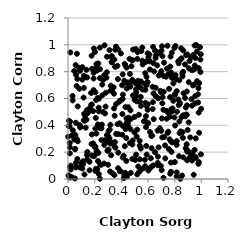
| Category | Series 0 |
|---|---|
| 0.046676937674423886 | 0.805 |
| 0.1731907339990109 | 0.641 |
| 0.23156018715488924 | 0.037 |
| 0.42760766730506783 | 0.851 |
| 0.5336893021140406 | 0.691 |
| 0.09268886672519401 | 0.39 |
| 0.6367927705438385 | 0.573 |
| 0.9290513467448243 | 0.811 |
| 0.5379660975195389 | 0.248 |
| 0.7785230968841657 | 0.503 |
| 0.4707104948257748 | 0.446 |
| 0.7468949703240096 | 0.343 |
| 0.8391897326390824 | 0.561 |
| 0.34968576601538326 | 0.241 |
| 0.6953053178982544 | 0.785 |
| 0.2968760122465636 | 0.21 |
| 0.5696426322543541 | 0.43 |
| 0.6722983463575628 | 0.103 |
| 0.41036892436965217 | 0.78 |
| 0.5864340884211007 | 0.246 |
| 0.4175408332572171 | 0.173 |
| 0.5846683655671804 | 0.873 |
| 0.8909354414835754 | 0.477 |
| 0.013335728364849 | 0.191 |
| 0.11955547361146536 | 0.679 |
| 0.7665870626792595 | 0.039 |
| 0.6250503684640436 | 0.321 |
| 0.1328308287717144 | 0.383 |
| 0.09125341376203373 | 0.384 |
| 0.519206114093471 | 0.368 |
| 0.5092706347199005 | 0.969 |
| 0.2057818210240638 | 0.646 |
| 0.917273317381685 | 0.31 |
| 0.08429098524658475 | 0.829 |
| 0.5367592920172873 | 0.686 |
| 0.37214312046848014 | 0.409 |
| 0.32955264627195086 | 0.869 |
| 0.4754985411567399 | 0.84 |
| 0.6524488144445785 | 0.2 |
| 0.08940384945948819 | 0.806 |
| 0.06554562086051482 | 0.298 |
| 0.7155857116474972 | 0.516 |
| 0.5565957550004644 | 0.881 |
| 0.07018524425496449 | 0.149 |
| 0.7394409686287119 | 0.449 |
| 0.8590399694918804 | 0.349 |
| 0.057574957408292556 | 0.848 |
| 0.1640557005931702 | 0.529 |
| 0.8646857087342421 | 0.475 |
| 0.597121755670744 | 0.937 |
| 0.22286788275097186 | 0.604 |
| 0.8962677892962819 | 0.211 |
| 0.05966879743334477 | 0.121 |
| 0.8829805018857326 | 0.23 |
| 0.4433115345549993 | 0.02 |
| 0.7727190102088954 | 0.053 |
| 0.5390898360487064 | 0.147 |
| 0.877691282450784 | 0.604 |
| 0.06703394839677779 | 0.934 |
| 0.6721994752635393 | 0.36 |
| 0.2846353952011683 | 0.643 |
| 0.3286666740754009 | 0.917 |
| 0.9331424568217861 | 0.189 |
| 0.25059040371349994 | 0.378 |
| 0.16177745395152135 | 0.065 |
| 0.14742301760385748 | 0.492 |
| 0.8595227222581635 | 0.765 |
| 0.3744627109753005 | 0.745 |
| 0.19228619816168752 | 0.792 |
| 0.2237660073145369 | 0.407 |
| 0.5092260927614612 | 0.711 |
| 0.7224204070046648 | 0.313 |
| 0.19194597458374296 | 0.749 |
| 0.2569839202288496 | 0.704 |
| 0.4314366114576344 | 0.372 |
| 0.0547269025426534 | 0.328 |
| 0.509920508866802 | 0.668 |
| 0.9805405721133529 | 0.827 |
| 0.8153659750011059 | 0.049 |
| 0.6747229036105801 | 0.166 |
| 0.4223224963584687 | 0.023 |
| 0.8628799058367227 | 0.799 |
| 0.8327770680637624 | 0.17 |
| 0.6208491824398406 | 0.154 |
| 0.5112553337236531 | 0.181 |
| 0.1950958757126044 | 0.17 |
| 0.3544520413392117 | 0.963 |
| 0.9212706771769078 | 0.193 |
| 0.3020972747949281 | 0.32 |
| 0.8375365185972018 | 0.569 |
| 0.052238632556893504 | 0.004 |
| 0.8130604562920429 | 0.743 |
| 0.9370957154208669 | 0.697 |
| 0.19401418803622206 | 0.972 |
| 0.9499446730407738 | 0.217 |
| 0.9395151472527965 | 0.925 |
| 0.036636022783196574 | 0.363 |
| 0.9255698461596198 | 0.595 |
| 0.7634444239329383 | 0.464 |
| 0.4866858603612687 | 0.623 |
| 0.38935800254068825 | 0.057 |
| 0.4557319380780795 | 0.457 |
| 0.24084133738431882 | 0.109 |
| 0.4056241756335786 | 0.699 |
| 0.7072956053577886 | 0.565 |
| 0.17869045569367317 | 0.332 |
| 0.2168766772427906 | 0.808 |
| 0.4097821111222963 | 0.597 |
| 0.4984210118251923 | 0.348 |
| 0.8934281752644695 | 0.14 |
| 0.7985944220098996 | 0.459 |
| 0.43978977307100736 | 0.717 |
| 0.23875659458211201 | 0.979 |
| 0.5146095974420601 | 0.579 |
| 0.752792451541724 | 0.781 |
| 0.20892436236240533 | 0.186 |
| 0.3156066523986101 | 0.056 |
| 0.8156582640601323 | 0.655 |
| 0.1773685117092146 | 0.175 |
| 0.3931472308274868 | 0.058 |
| 0.01286693904584747 | 0.268 |
| 0.6878301164890219 | 0.938 |
| 0.9302752011022033 | 0.138 |
| 0.597187901010962 | 0.516 |
| 0.32052714300663593 | 0.695 |
| 0.2168477848707807 | 0.839 |
| 0.38875025675613023 | 0.582 |
| 0.01736045135898978 | 0.943 |
| 0.8976954201139312 | 0.365 |
| 0.30467689092527306 | 0.357 |
| 0.9838768596884649 | 0.715 |
| 0.7998085724246662 | 0.626 |
| 0.4377117583783472 | 0.134 |
| 0.20186721276086267 | 0.947 |
| 0.8308493931554167 | 0.55 |
| 0.7084889299643606 | 0.915 |
| 0.6994989402984891 | 0.359 |
| 0.23003936401347205 | 0.532 |
| 0.5799627387163104 | 0.664 |
| 0.589466531291116 | 0.7 |
| 0.9785981418582956 | 0.677 |
| 0.6147685263011925 | 0.351 |
| 0.3828943100506701 | 0.575 |
| 0.23957370365303335 | 0.819 |
| 0.5819730832315049 | 0.568 |
| 0.0471722198335955 | 0.293 |
| 0.9747172168335393 | 0.631 |
| 0.4851650287341322 | 0.287 |
| 0.2090150252280079 | 0.076 |
| 0.29189423171228585 | 0.327 |
| 0.7727391313128991 | 0.279 |
| 0.14242598938925052 | 0.178 |
| 0.942835989518905 | 0.031 |
| 0.5403230809583446 | 0.577 |
| 0.4681067112876465 | 0.372 |
| 0.8515045136892441 | 0.461 |
| 0.6463657964301295 | 0.802 |
| 0.23893202538417474 | 0.003 |
| 0.49045672037080884 | 0.726 |
| 0.3706067786411054 | 0.843 |
| 0.011603717096283836 | 0.011 |
| 0.13044044634643015 | 0.759 |
| 0.7741159163835692 | 0.519 |
| 0.7351591692281364 | 0.762 |
| 0.8995198972721726 | 0.208 |
| 0.2196414838713818 | 0.074 |
| 0.059234877027061233 | 0.419 |
| 0.5572932057896541 | 0.98 |
| 0.9817779440189164 | 0.126 |
| 0.27404348837066406 | 0.996 |
| 0.6528094300983222 | 0.955 |
| 0.11687470963969998 | 0.607 |
| 0.28181051340614854 | 0.539 |
| 0.7568397486729 | 0.223 |
| 0.520176294162281 | 0.896 |
| 0.5795129214809566 | 0.789 |
| 0.021428901937924915 | 0.1 |
| 0.38695176546716287 | 0.415 |
| 0.49946462558968147 | 0.591 |
| 0.6014732816024693 | 0.417 |
| 0.2712519921636725 | 0.774 |
| 0.13853399145398415 | 0.442 |
| 0.8556199636965999 | 0.026 |
| 0.8344403950042217 | 0.736 |
| 0.7901646861157391 | 0.713 |
| 0.752416801457777 | 0.353 |
| 0.16144195128851072 | 0.129 |
| 0.028684990321949867 | 0.324 |
| 0.9681500463335102 | 0.729 |
| 0.5454567520497118 | 0.613 |
| 0.18899549003778846 | 0.265 |
| 0.32327126791351357 | 0.177 |
| 0.5901798876041708 | 0.182 |
| 0.12360925044257637 | 0.034 |
| 0.8941179046650222 | 0.205 |
| 0.8454051927353424 | 0.354 |
| 0.3110599835457872 | 0.302 |
| 0.46474136235282115 | 0.783 |
| 0.7666994723166691 | 0.838 |
| 0.47757962831922895 | 0.888 |
| 0.5964522816426117 | 0.723 |
| 0.3230929309330791 | 0.271 |
| 0.4404803323994665 | 0.674 |
| 0.5375475191852845 | 0.285 |
| 0.33392427875408065 | 0.042 |
| 0.24889701971087067 | 0.106 |
| 0.0010635826426977852 | 0.315 |
| 0.30048827100565284 | 0.106 |
| 0.6770147875417601 | 0.601 |
| 0.3603756276541707 | 0.558 |
| 0.8147388297407242 | 0.02 |
| 0.5250355212838486 | 0.732 |
| 0.584997234121754 | 0.386 |
| 0.7282032309949886 | 0.25 |
| 0.46795644756283933 | 0.512 |
| 0.39663160583756957 | 0.936 |
| 0.004017448057230958 | 0.026 |
| 0.034287747404613475 | 0.619 |
| 0.6318326608256549 | 0.324 |
| 0.6793232202820944 | 0.235 |
| 0.6219023781600583 | 0.088 |
| 0.40665322084471983 | 0.33 |
| 0.4301725525817708 | 0.536 |
| 0.005926100241357826 | 0.394 |
| 0.18058778471610612 | 0.821 |
| 0.4849873381048481 | 0.885 |
| 0.17822526094861293 | 0.555 |
| 0.23142157496354893 | 0.505 |
| 0.1388701952417476 | 0.814 |
| 0.7532573207696533 | 0.494 |
| 0.7839074247458218 | 0.526 |
| 0.6117314428070794 | 0.077 |
| 0.05228154762342658 | 0.222 |
| 0.33103349226327805 | 0.661 |
| 0.27751942156855225 | 0.489 |
| 0.4826434473045821 | 0.257 |
| 0.7292939424367355 | 0.154 |
| 0.7718510145786598 | 0.122 |
| 0.7009824638826786 | 0.957 |
| 0.6997395988194663 | 0.803 |
| 0.5458758141814352 | 0.227 |
| 0.42218435398407644 | 0.733 |
| 0.5326873376344007 | 0.052 |
| 0.20104690119422503 | 0.239 |
| 0.22739539564156597 | 0.194 |
| 0.11404873586985102 | 0.111 |
| 0.6966209705767614 | 0.097 |
| 0.2536996646733097 | 0.405 |
| 0.029349135643793933 | 0.013 |
| 0.4191301906429188 | 0.006 |
| 0.6965018484824774 | 0.648 |
| 0.261613111439334 | 0.5 |
| 0.09031626180511935 | 0.086 |
| 0.8617144096504336 | 0.307 |
| 0.6623028654885308 | 0.95 |
| 0.8047026871852438 | 0.634 |
| 0.5795040314999311 | 0.096 |
| 0.9509197089460705 | 0.846 |
| 0.9116271095676838 | 0.88 |
| 0.7653796191227267 | 0.61 |
| 0.7982351386778459 | 0.977 |
| 0.6567747601375253 | 0.902 |
| 0.7763192005087426 | 0.202 |
| 0.360275278710591 | 0.336 |
| 0.5267040356092753 | 0.093 |
| 0.12472536284638086 | 0.436 |
| 0.3178613780326637 | 0.404 |
| 0.034895528340997774 | 0.586 |
| 0.9541997551984307 | 0.564 |
| 0.26219415900358123 | 0.738 |
| 0.9759566808740957 | 0.57 |
| 0.06406409400634035 | 0.298 |
| 0.702666696735508 | 0.066 |
| 0.06018690966733417 | 0.777 |
| 0.8775115392148062 | 0.854 |
| 0.2753304862945135 | 0.289 |
| 0.17473535762787337 | 0.554 |
| 0.3279488693203214 | 0.871 |
| 0.6143881808407408 | 0.817 |
| 0.3113338534782187 | 0.96 |
| 0.22482096264188062 | 0.134 |
| 0.8650165731351144 | 0.161 |
| 0.5116528102095552 | 0.646 |
| 0.8442961135586228 | 0.892 |
| 0.42586921903577735 | 0.245 |
| 0.14996468605418806 | 0.497 |
| 0.6348286272017003 | 0.521 |
| 0.4999931282567323 | 0.463 |
| 0.05405943608713265 | 0.224 |
| 0.9773985862411543 | 0.113 |
| 0.4707546040542924 | 0.045 |
| 0.5054530087620377 | 0.142 |
| 0.7429478002552824 | 0.823 |
| 0.23562032283682216 | 0.381 |
| 0.547349668052422 | 0.545 |
| 0.6427055654996492 | 0.446 |
| 0.6596077660288989 | 0.615 |
| 0.5489249252545415 | 0.07 |
| 0.5498278083829402 | 0.954 |
| 0.10751676692487913 | 0.078 |
| 0.762517824391527 | 0.296 |
| 0.5099286013655342 | 0.621 |
| 0.35000501313897375 | 0.471 |
| 0.8803495025709801 | 0.467 |
| 0.4296417057332826 | 0.046 |
| 0.17719850614638696 | 0.919 |
| 0.2920733755424991 | 0.911 |
| 0.7462450643580057 | 0.993 |
| 0.602907782331563 | 0.905 |
| 0.9929195489582779 | 0.89 |
| 0.06477872015754783 | 0.693 |
| 0.5893531135583372 | 0.543 |
| 0.4521831901090685 | 0.39 |
| 0.43695466735920246 | 0.305 |
| 0.34800778798052007 | 0.029 |
| 0.5190108359200212 | 0.035 |
| 0.21089338614616993 | 0.589 |
| 0.3535897971083259 | 0.836 |
| 0.9499482972654503 | 0.995 |
| 0.8900513913134721 | 0.259 |
| 0.20531044773496626 | 0.06 |
| 0.06988730031232145 | 0.746 |
| 0.827024461425214 | 0.593 |
| 0.5151721267317756 | 0.316 |
| 0.14492622633513338 | 0.201 |
| 0.2578332420932501 | 0.624 |
| 0.05904667961419439 | 0.087 |
| 0.610637764297836 | 0.927 |
| 0.5751061505551872 | 0.709 |
| 0.6580167238168255 | 0.68 |
| 0.4524635927805768 | 0.535 |
| 0.990369149846694 | 0.983 |
| 0.8425466244286772 | 0.001 |
| 0.4495421552162856 | 0.413 |
| 0.015900933295398826 | 0.428 |
| 0.957961263671676 | 0.302 |
| 0.3973389604751989 | 0.587 |
| 0.6378950347058552 | 0.985 |
| 0.9667757710414732 | 0.95 |
| 0.1213800841724869 | 0.486 |
| 0.0885522296969212 | 0.401 |
| 0.17695083299720848 | 0.261 |
| 0.37722946494891824 | 0.196 |
| 0.46154528586146715 | 0.896 |
| 0.7163863908999234 | 0.009 |
| 0.7204091490595579 | 0.867 |
| 0.3628780821798959 | 0.972 |
| 0.5848214861149837 | 0.469 |
| 0.945118709762319 | 0.705 |
| 0.8016530323521839 | 0.126 |
| 0.7071751713168705 | 0.31 |
| 0.20501177725771602 | 0.375 |
| 0.9834342100472789 | 0.345 |
| 0.351793660552625 | 0.275 |
| 0.7692624707880285 | 0.913 |
| 0.7197517543221705 | 0.767 |
| 0.8160482211995947 | 0.283 |
| 0.7386796991757151 | 0.508 |
| 0.01131254985869165 | 0.393 |
| 0.4640189177873881 | 0.268 |
| 0.8864602373824809 | 0.481 |
| 0.6688771296491367 | 0.847 |
| 0.7099371441382194 | 0.61 |
| 0.9577844659695542 | 0.157 |
| 0.4824444248860417 | 0.74 |
| 0.560051431718217 | 0.854 |
| 0.0733326902855516 | 0.281 |
| 0.0729282425018432 | 0.541 |
| 0.914639213226625 | 0.163 |
| 0.7582573063526906 | 0.672 |
| 0.817294212596679 | 0.501 |
| 0.5215242595917049 | 0.945 |
| 0.9057558737165539 | 0.722 |
| 0.31306145721162937 | 0.368 |
| 0.4880793085549877 | 0.964 |
| 0.20477014177567027 | 0.242 |
| 0.2084721523131198 | 0.455 |
| 0.7726117846574002 | 0.793 |
| 0.22727546776773266 | 0.861 |
| 0.013736217169282347 | 0.236 |
| 0.6807876227893973 | 0.771 |
| 0.43844322872972913 | 0.452 |
| 0.1263784011054417 | 0.435 |
| 0.2130831507313603 | 0.856 |
| 0.9969850894983238 | 0.184 |
| 0.9051153431127194 | 0.422 |
| 0.8866396800112862 | 0.924 |
| 0.6738144842029629 | 0.12 |
| 0.14237165835493618 | 0.757 |
| 0.8054398134099673 | 0.991 |
| 0.8268740951494604 | 0.876 |
| 0.3553849862873231 | 0.233 |
| 0.6885416956836965 | 0.378 |
| 0.5887692642433846 | 0.762 |
| 0.4680082834914421 | 0.689 |
| 0.291620661692459 | 0.796 |
| 0.4504296442553802 | 0.719 |
| 0.4235039693484443 | 0.041 |
| 0.014502209180590671 | 0.091 |
| 0.8068924064484292 | 0.775 |
| 0.28896192931179143 | 0.755 |
| 0.3760376444659641 | 0.967 |
| 0.8037669939467939 | 0.399 |
| 0.8491277289171141 | 0.974 |
| 0.4074433069660559 | 0.484 |
| 0.5476679919790673 | 0.727 |
| 0.9223575799900378 | 0.907 |
| 0.6339496376838221 | 0.687 |
| 0.7895772712345045 | 0.583 |
| 0.0073682798715560835 | 0.434 |
| 0.11177156094417802 | 0.132 |
| 0.6941883951354908 | 0.657 |
| 0.3178691684323005 | 0.264 |
| 0.29427532823703834 | 0.277 |
| 0.8665931970179298 | 0.639 |
| 0.9957845530235843 | 0.93 |
| 0.2321842783138936 | 0.599 |
| 0.9448269075835343 | 0.815 |
| 0.6591246140997019 | 0.921 |
| 0.4440453885580857 | 0.426 |
| 0.4249046339863435 | 0.858 |
| 0.021047927732604332 | 0.016 |
| 0.1407439789725133 | 0.513 |
| 0.5592948711447782 | 0.666 |
| 0.09979321074192071 | 0.118 |
| 0.12725986349199214 | 0.473 |
| 0.6031046184695127 | 0.064 |
| 0.239890030508761 | 0.752 |
| 0.4580795722123372 | 0.707 |
| 0.43952468403163913 | 0.83 |
| 0.1320184762354557 | 0.441 |
| 0.37739381307627096 | 0.334 |
| 0.8641691870170831 | 0.958 |
| 0.21238189883054734 | 0.339 |
| 0.7787356329675972 | 0.941 |
| 0.34539305985665936 | 0.526 |
| 0.8572487527551992 | 0.787 |
| 0.8355351632370608 | 0.429 |
| 0.11854171949387114 | 0.438 |
| 0.9983595637995429 | 0.523 |
| 0.10712872624642594 | 0.834 |
| 0.3450268428644252 | 0.636 |
| 0.9553515733923481 | 0.902 |
| 0.9802293740157771 | 0.495 |
| 0.14389767309145657 | 0.146 |
| 0.8300500753888632 | 0.862 |
| 0.9937197946796977 | 0.797 |
| 0.11918515435954471 | 0.77 |
| 0.8367460009961701 | 0.341 |
| 0.37639336459731787 | 0.08 |
| 0.4821943390059885 | 0.15 |
| 0.18837992829220385 | 0.506 |
| 0.01322214938965575 | 0.015 |
| 0.08575674152579905 | 0.673 |
| 0.7051792200300068 | 0.989 |
| 0.21435061862010035 | 0.212 |
| 0.8517125389336334 | 0.899 |
| 0.4093336191357683 | 0.396 |
| 0.5877415547859629 | 0.424 |
| 0.7799395880866352 | 0.753 |
| 0.8832035980113807 | 0.533 |
| 0.6383708210354998 | 0.101 |
| 0.7834557778317598 | 0.273 |
| 0.25113746496731176 | 0.29 |
| 0.13484702916570515 | 0.483 |
| 0.569363160010475 | 0.082 |
| 0.9613205594875824 | 0.999 |
| 0.41192651871370467 | 0.629 |
| 0.8909954591692096 | 0.652 |
| 0.27216475657484696 | 0.254 |
| 0.30483965440226085 | 0.218 |
| 0.32573122349129563 | 0.909 |
| 0.4378301841881923 | 0.411 |
| 0.8948172784130509 | 0.928 |
| 0.19206636683643993 | 0.663 |
| 0.3192078632978032 | 0.658 |
| 0.8149757212156591 | 0.254 |
| 0.8918219632637219 | 0.549 |
| 0.531831426468567 | 0.479 |
| 0.10711741238548667 | 0.741 |
| 0.020121882544743327 | 0.071 |
| 0.5767958426044177 | 0.143 |
| 0.9561467307828785 | 0.164 |
| 0.2707869686305772 | 0.116 |
| 0.953980418301124 | 0.618 |
| 0.9294904942453207 | 0.547 |
| 0.8359218522264941 | 0.883 |
| 0.7178407115800389 | 0.65 |
| 0.641645185249537 | 0.638 |
| 0.5984196530813781 | 0.557 |
| 0.6402602953217132 | 0.864 |
| 0.7035035428348062 | 0.451 |
| 0.6142129476079128 | 0.877 |
| 0.29754501940942396 | 0.215 |
| 0.6269310440109518 | 0.229 |
| 0.3599466974670619 | 0.987 |
| 0.34183952123713585 | 0.683 |
| 0.3475471836387128 | 0.89 |
| 0.9065237314413043 | 0.826 |
| 0.41069421555246544 | 0.16 |